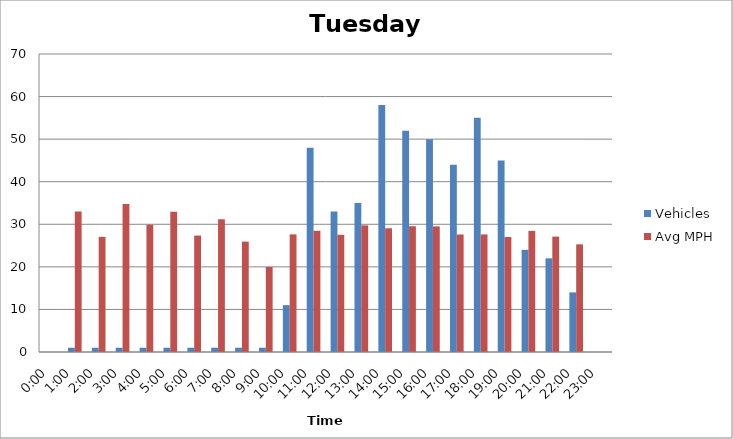
| Category | Vehicles | Avg MPH |
|---|---|---|
| 0:00 | 0 | 0 |
| 1:00 | 1 | 33.03 |
| 2:00 | 1 | 27.05 |
| 3:00 | 1 | 34.78 |
| 4:00 | 1 | 29.9 |
| 5:00 | 1 | 32.94 |
| 6:00 | 1 | 27.35 |
| 7:00 | 1 | 31.18 |
| 8:00 | 1 | 25.93 |
| 9:00 | 1 | 19.97 |
| 10:00 | 11 | 27.63 |
| 11:00 | 48 | 28.47 |
| 12:00 | 33 | 27.53 |
| 13:00 | 35 | 29.74 |
| 14:00 | 58 | 29.06 |
| 15:00 | 52 | 29.54 |
| 16:00 | 50 | 29.5 |
| 17:00 | 44 | 27.6 |
| 18:00 | 55 | 27.62 |
| 19:00 | 45 | 27.01 |
| 20:00 | 24 | 28.45 |
| 21:00 | 22 | 27.11 |
| 22:00 | 14 | 25.29 |
| 23:00 | 0 | 0 |